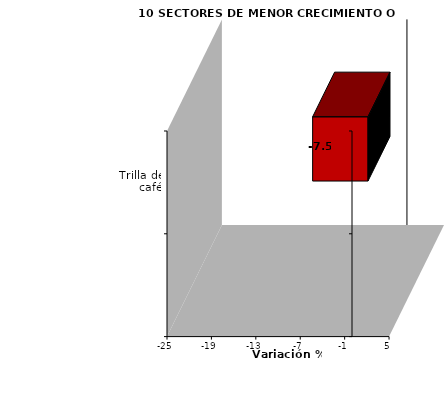
| Category | Series 0 |
|---|---|
| Trilla de café | -7.481 |